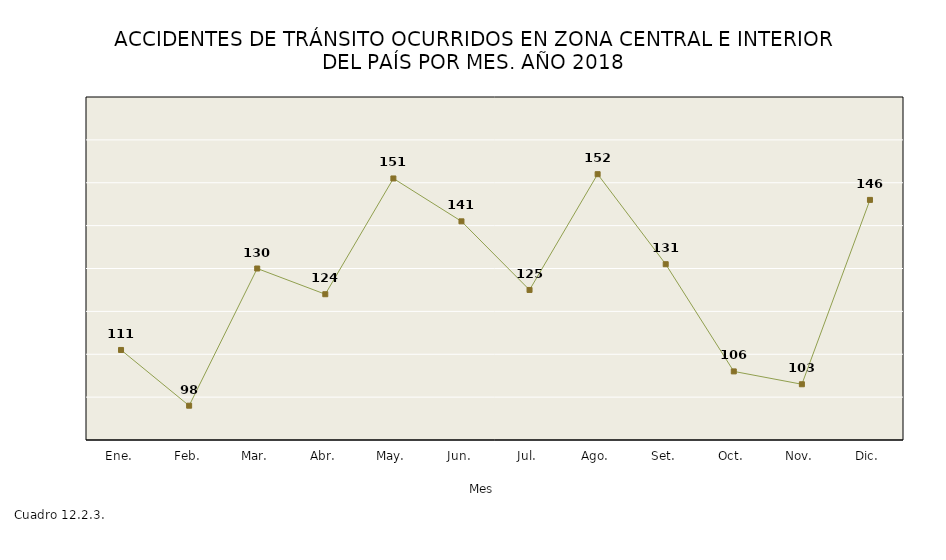
| Category | Series 0 |
|---|---|
| Ene. | 111 |
| Feb. | 98 |
| Mar. | 130 |
| Abr. | 124 |
| May. | 151 |
| Jun. | 141 |
| Jul. | 125 |
| Ago. | 152 |
| Set. | 131 |
| Oct. | 106 |
| Nov. | 103 |
| Dic. | 146 |